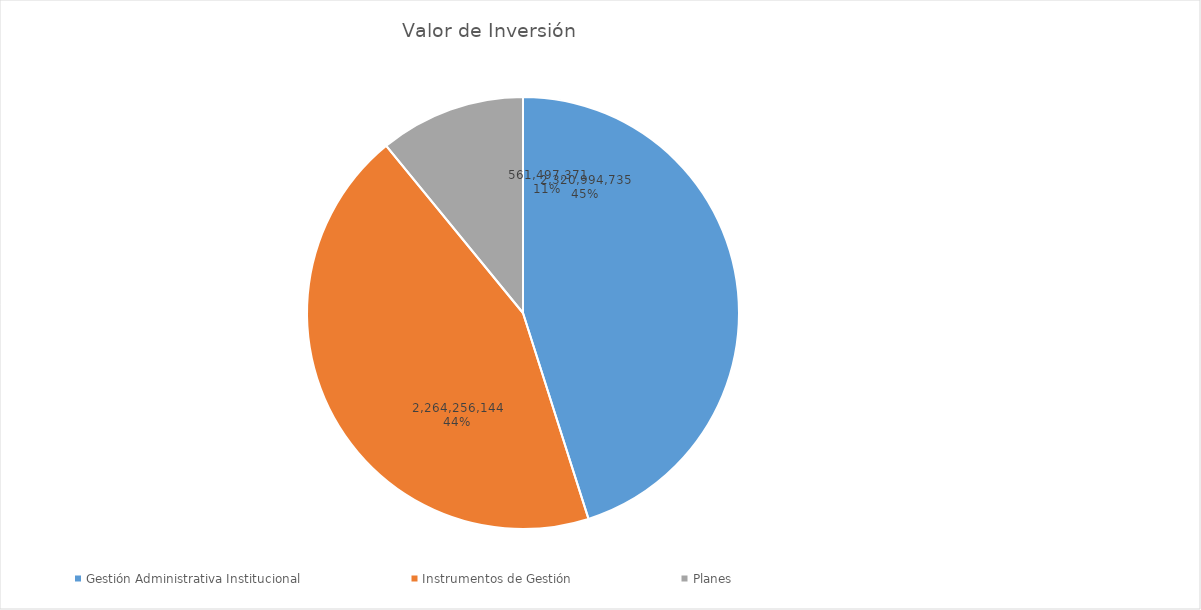
| Category | Valor de Inversión | Porcentaje de Ejecución dentro de la Actividad |
|---|---|---|
| Gestión Administrativa Institucional | 2320994735 | 7 |
| Instrumentos de Gestión | 2264256144 | 8 |
| Planes | 561497371 | 5 |